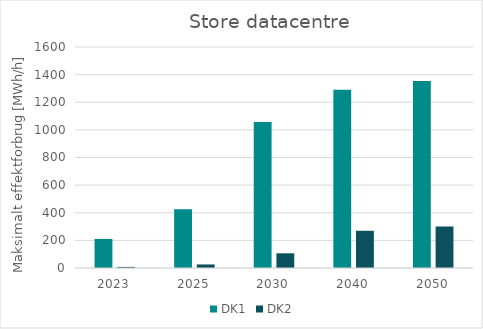
| Category | DK1 | DK2 |
|---|---|---|
| 2023.0 | 210.42 | 7.837 |
| 2025.0 | 424.602 | 25.7 |
| 2030.0 | 1056.568 | 106.437 |
| 2040.0 | 1291.281 | 269.449 |
| 2050.0 | 1353.568 | 300.5 |